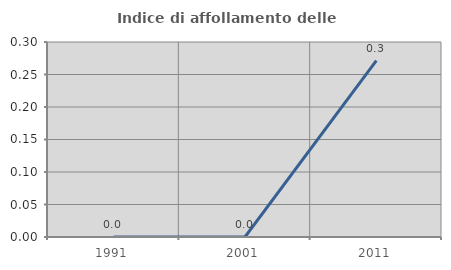
| Category | Indice di affollamento delle abitazioni  |
|---|---|
| 1991.0 | 0 |
| 2001.0 | 0 |
| 2011.0 | 0.271 |